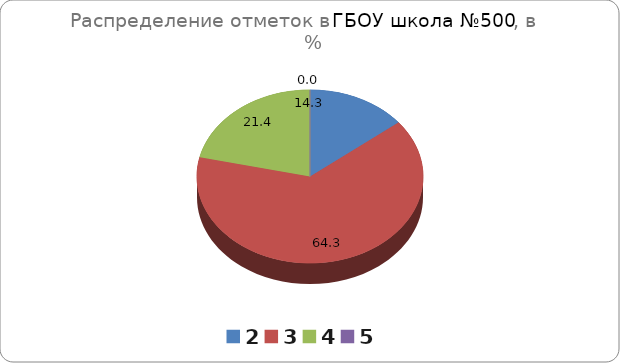
| Category | ГБОУ СОШ №500 |
|---|---|
| 2.0 | 14.29 |
| 3.0 | 64.29 |
| 4.0 | 21.43 |
| 5.0 | 0 |